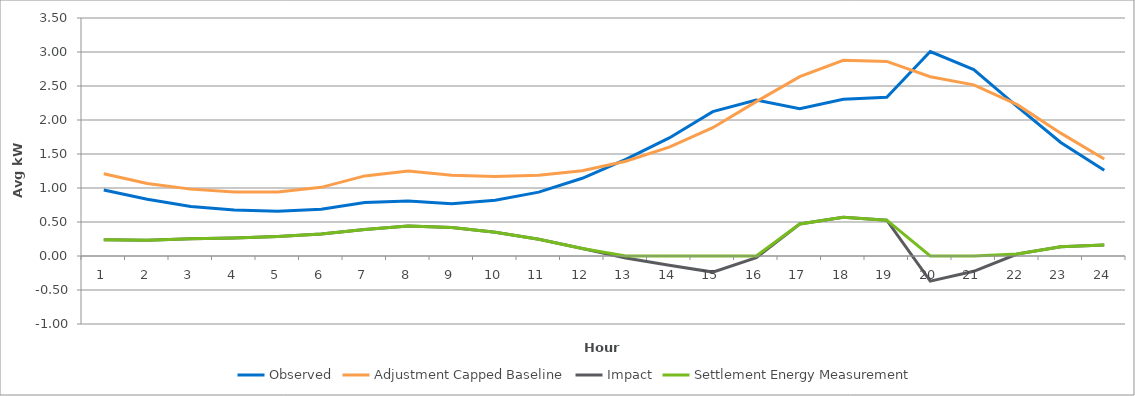
| Category | Observed | Adjustment Capped Baseline | Impact | Settlement Energy Measurement |
|---|---|---|---|---|
| 0 | 0.971 | 1.211 | 0.239 | 0.239 |
| 1 | 0.833 | 1.066 | 0.233 | 0.233 |
| 2 | 0.73 | 0.983 | 0.254 | 0.254 |
| 3 | 0.678 | 0.941 | 0.263 | 0.263 |
| 4 | 0.657 | 0.942 | 0.286 | 0.286 |
| 5 | 0.686 | 1.01 | 0.324 | 0.324 |
| 6 | 0.788 | 1.178 | 0.39 | 0.39 |
| 7 | 0.811 | 1.251 | 0.44 | 0.44 |
| 8 | 0.77 | 1.189 | 0.419 | 0.419 |
| 9 | 0.82 | 1.169 | 0.35 | 0.35 |
| 10 | 0.939 | 1.187 | 0.247 | 0.247 |
| 11 | 1.143 | 1.254 | 0.111 | 0.111 |
| 12 | 1.422 | 1.393 | -0.029 | 0 |
| 13 | 1.736 | 1.601 | -0.136 | 0 |
| 14 | 2.124 | 1.887 | -0.237 | 0 |
| 15 | 2.294 | 2.271 | -0.024 | 0 |
| 16 | 2.166 | 2.638 | 0.471 | 0.471 |
| 17 | 2.306 | 2.877 | 0.571 | 0.571 |
| 18 | 2.334 | 2.862 | 0.527 | 0.527 |
| 19 | 3.006 | 2.637 | -0.369 | 0 |
| 20 | 2.742 | 2.516 | -0.225 | 0 |
| 21 | 2.197 | 2.226 | 0.028 | 0.028 |
| 22 | 1.67 | 1.807 | 0.136 | 0.136 |
| 23 | 1.263 | 1.426 | 0.163 | 0.163 |